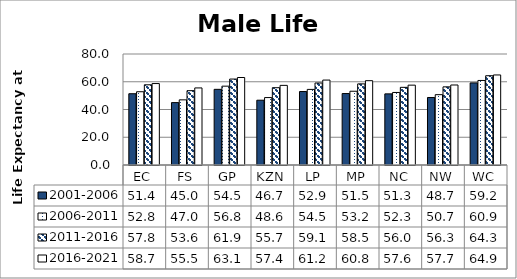
| Category | 2001-2006 | 2006-2011 | 2011-2016 | 2016-2021 |
|---|---|---|---|---|
| EC | 51.367 | 52.8 | 57.802 | 58.696 |
| FS | 44.967 | 46.958 | 53.569 | 55.545 |
| GP | 54.532 | 56.822 | 61.945 | 63.054 |
| KZN | 46.694 | 48.596 | 55.706 | 57.394 |
| LP | 52.944 | 54.488 | 59.089 | 61.206 |
| MP | 51.496 | 53.155 | 58.461 | 60.768 |
| NC | 51.27 | 52.283 | 55.971 | 57.555 |
| NW | 48.655 | 50.689 | 56.328 | 57.661 |
| WC | 59.16 | 60.931 | 64.341 | 64.889 |